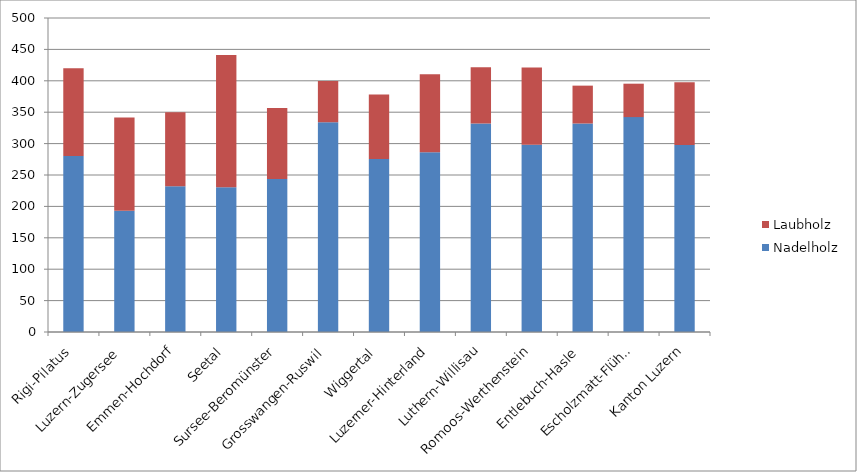
| Category | Nadelholz | Laubholz |
|---|---|---|
| Rigi-Pilatus | 280.3 | 139.7 |
| Luzern-Zugersee | 193 | 148.7 |
| Emmen-Hochdorf | 232.1 | 117.9 |
| Seetal | 230.4 | 210.5 |
| Sursee-Beromünster | 243.7 | 112.8 |
| Grosswangen-Ruswil | 333.8 | 66 |
| Wiggertal | 275.5 | 102.8 |
| Luzerner-Hinterland | 286.3 | 124.2 |
| Luthern-Willisau | 331.9 | 89.5 |
| Romoos-Werthenstein | 298.1 | 122.9 |
| Entlebuch-Hasle | 332 | 60.3 |
| Escholzmatt-Flühli | 342.2 | 53.2 |
| Kanton Luzern | 297.8 | 99.7 |